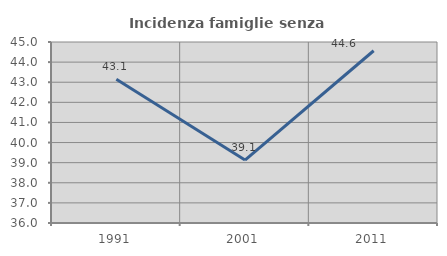
| Category | Incidenza famiglie senza nuclei |
|---|---|
| 1991.0 | 43.147 |
| 2001.0 | 39.13 |
| 2011.0 | 44.565 |